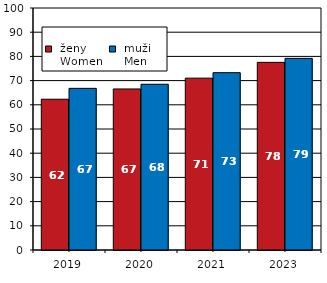
| Category |  ženy 
 Women |  muži 
 Men |
|---|---|---|
| 2019.0 | 62.3 | 66.8 |
| 2020.0 | 66.553 | 68.492 |
| 2021.0 | 71.01 | 73.27 |
| 2023.0 | 77.544 | 79.187 |